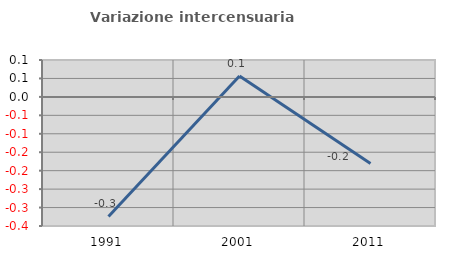
| Category | Variazione intercensuaria annua |
|---|---|
| 1991.0 | -0.324 |
| 2001.0 | 0.057 |
| 2011.0 | -0.18 |